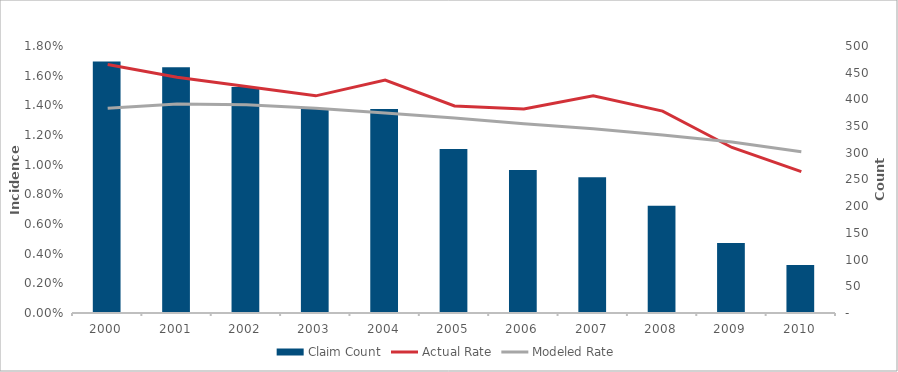
| Category | Claim Count |
|---|---|
| 2000.0 | 471 |
| 2001.0 | 460 |
| 2002.0 | 423 |
| 2003.0 | 382 |
| 2004.0 | 382 |
| 2005.0 | 307 |
| 2006.0 | 268 |
| 2007.0 | 254 |
| 2008.0 | 201 |
| 2009.0 | 131 |
| 2010.0 | 90 |